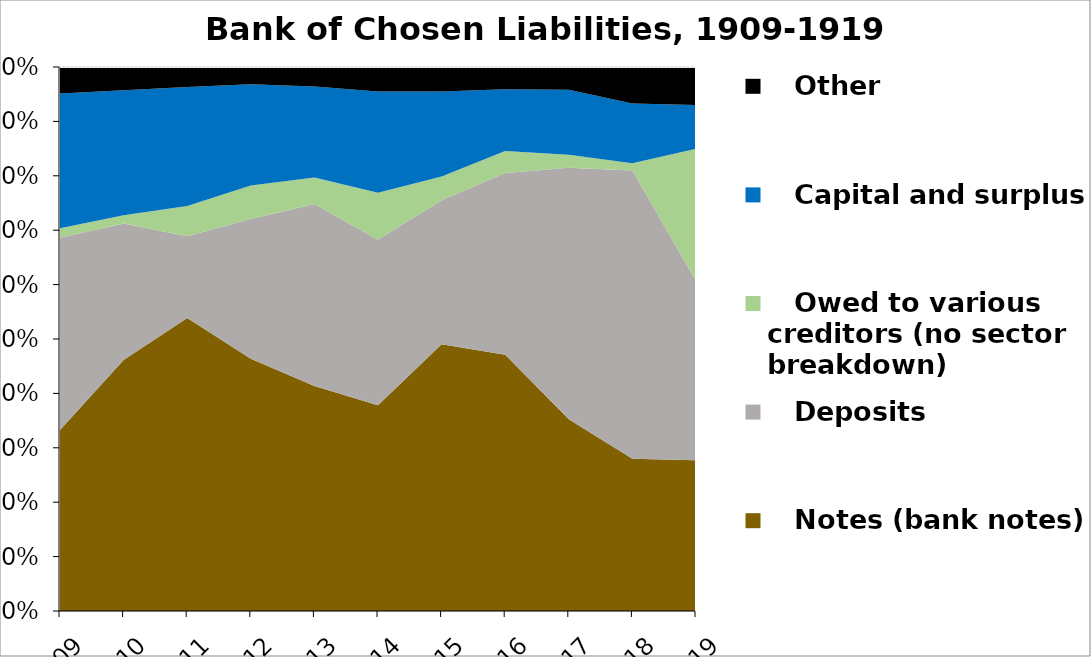
| Category |    Notes (bank notes) |    Deposits |    Owed to various creditors (no sector breakdown) |    Capital and surplus |    Other |
|---|---|---|---|---|---|
| 1909.0 | 13439700 | 14256823 | 717867 | 10000000 | 1962087 |
| 1910.0 | 20163900 | 10960650 | 646253 | 10047169 | 1866060 |
| 1911.0 | 25006540 | 6978281 | 2574925 | 10156700 | 1700848 |
| 1912.0 | 25550400 | 14169877 | 3373596 | 10274873 | 1736639 |
| 1913.0 | 25693260 | 20801924 | 3036230 | 10400174 | 2223454 |
| 1914.0 | 21850370 | 17598503 | 4989380 | 10748727 | 2612714 |
| 1915.0 | 34387520 | 18588600 | 3060338 | 10933950 | 3173812 |
| 1916.0 | 46627080 | 33033409 | 4020430 | 11218970 | 4055793 |
| 1917.0 | 67364949 | 88413372 | 4525119 | 22840130 | 8018147 |
| 1918.0 | 115523670 | 218960149 | 5440593 | 45381466 | 27755257 |
| 1919.0 | 163600055 | 194300800 | 143450246 | 47340573 | 41375690 |